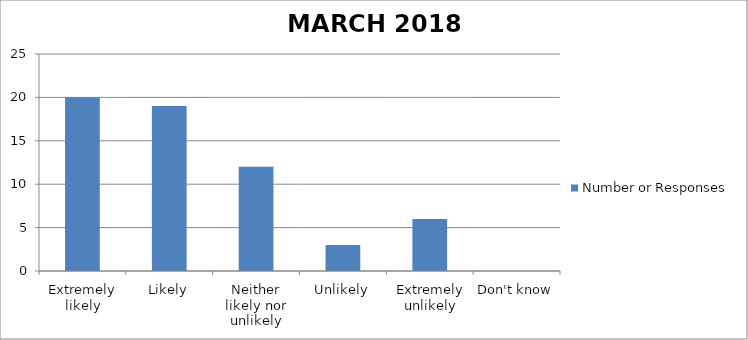
| Category | Number or Responses |
|---|---|
| Extremely likely | 20 |
| Likely | 19 |
| Neither likely nor unlikely | 12 |
| Unlikely | 3 |
| Extremely unlikely | 6 |
| Don't know | 0 |